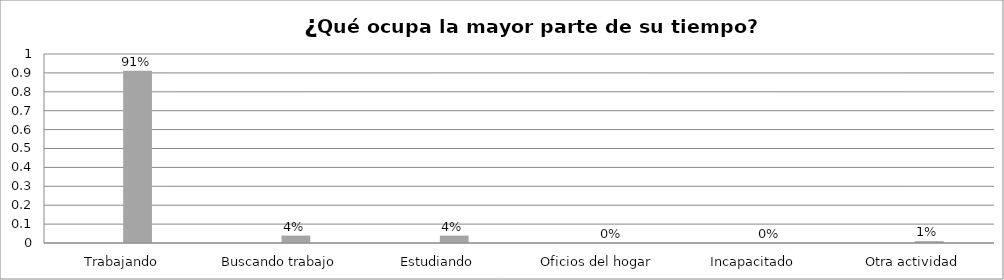
| Category | Series 0 | Series 1 | Series 2 | Series 3 |
|---|---|---|---|---|
| Trabajando |  |  | 0.912 |  |
| Buscando trabajo |  |  | 0.039 |  |
| Estudiando |  |  | 0.039 |  |
| Oficios del hogar |  |  | 0 |  |
| Incapacitado  |  |  | 0 |  |
| Otra actividad |  |  | 0.01 |  |